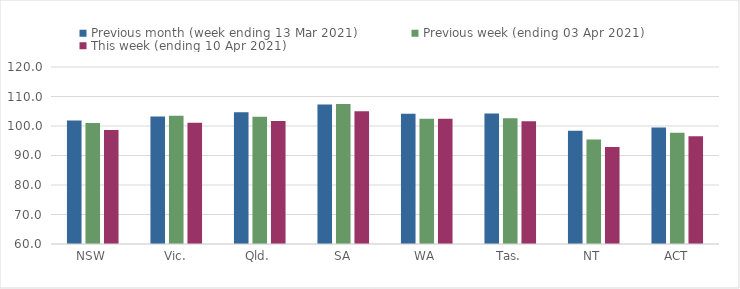
| Category | Previous month (week ending 13 Mar 2021) | Previous week (ending 03 Apr 2021) | This week (ending 10 Apr 2021) |
|---|---|---|---|
| NSW | 101.88 | 100.98 | 98.66 |
| Vic. | 103.22 | 103.46 | 101.1 |
| Qld. | 104.64 | 103.13 | 101.67 |
| SA | 107.28 | 107.45 | 104.98 |
| WA | 104.16 | 102.49 | 102.49 |
| Tas. | 104.21 | 102.66 | 101.58 |
| NT | 98.43 | 95.44 | 92.86 |
| ACT | 99.51 | 97.75 | 96.54 |